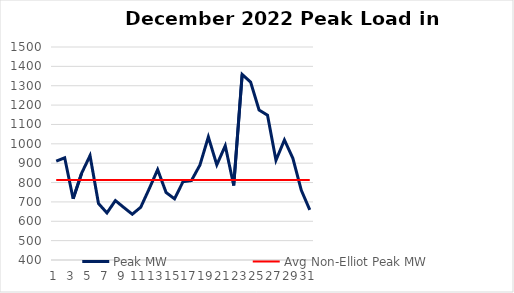
| Category | Peak MW | Avg Non-Elliot Peak MW |
|---|---|---|
| 0 | 910.991 | 812.86 |
| 1 | 928.091 | 812.86 |
| 2 | 716.126 | 812.86 |
| 3 | 847.703 | 812.86 |
| 4 | 939.035 | 812.86 |
| 5 | 691.75 | 812.86 |
| 6 | 643.073 | 812.86 |
| 7 | 706.879 | 812.86 |
| 8 | 671.075 | 812.86 |
| 9 | 636.39 | 812.86 |
| 10 | 672.624 | 812.86 |
| 11 | 767.65 | 812.86 |
| 12 | 866.77 | 812.86 |
| 13 | 748.47 | 812.86 |
| 14 | 715.98 | 812.86 |
| 15 | 804.273 | 812.86 |
| 16 | 810.307 | 812.86 |
| 17 | 890.076 | 812.86 |
| 18 | 1035.668 | 812.86 |
| 19 | 891.502 | 812.86 |
| 20 | 990.079 | 812.86 |
| 21 | 784.775 | 812.86 |
| 22 | 1358.136 | 812.86 |
| 23 | 1318.773 | 812.86 |
| 24 | 1174.566 | 812.86 |
| 25 | 1148.041 | 812.86 |
| 26 | 914.607 | 812.86 |
| 27 | 1019.809 | 812.86 |
| 28 | 925.144 | 812.86 |
| 29 | 759.862 | 812.86 |
| 30 | 658.563 | 812.86 |